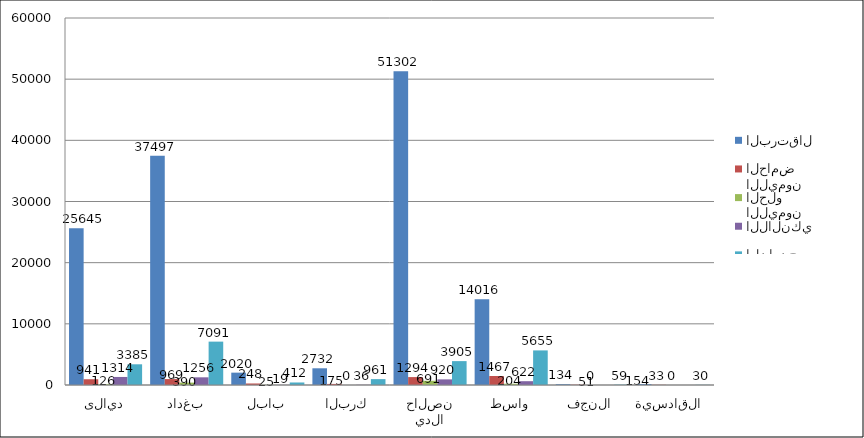
| Category | البرتقال | الليمون الحامض | الليمون الحلو | اللالنكي | النارنج |
|---|---|---|---|---|---|
| ديالى | 25645 | 941 | 126 | 1314 | 3385 |
| بغداد | 37497 | 969 | 390 | 1256 | 7091 |
| بابل | 2020 | 248 | 25 | 19 | 412 |
| كربلاء | 2732 | 175 | 0 | 36 | 961 |
| صلاح الدين  | 51302 | 1294 | 691 | 920 | 3905 |
| واسط | 14016 | 1467 | 204 | 622 | 5655 |
| النجف | 134 | 51 | 0 | 0 | 59 |
| القادسية  | 154 | 33 | 0 | 0 | 30 |